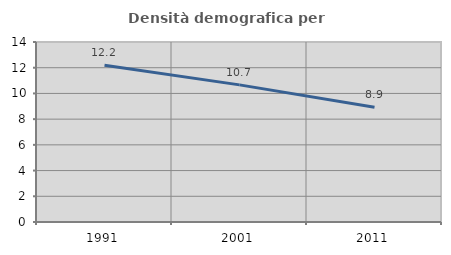
| Category | Densità demografica |
|---|---|
| 1991.0 | 12.2 |
| 2001.0 | 10.666 |
| 2011.0 | 8.931 |